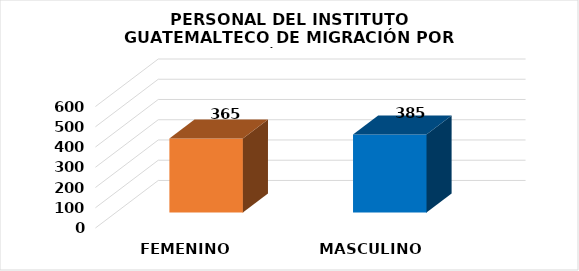
| Category | Series 0 |
|---|---|
| FEMENINO | 365 |
| MASCULINO | 385 |